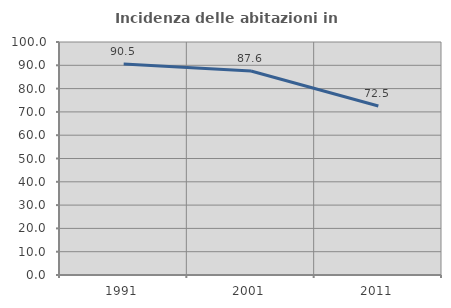
| Category | Incidenza delle abitazioni in proprietà  |
|---|---|
| 1991.0 | 90.526 |
| 2001.0 | 87.576 |
| 2011.0 | 72.549 |